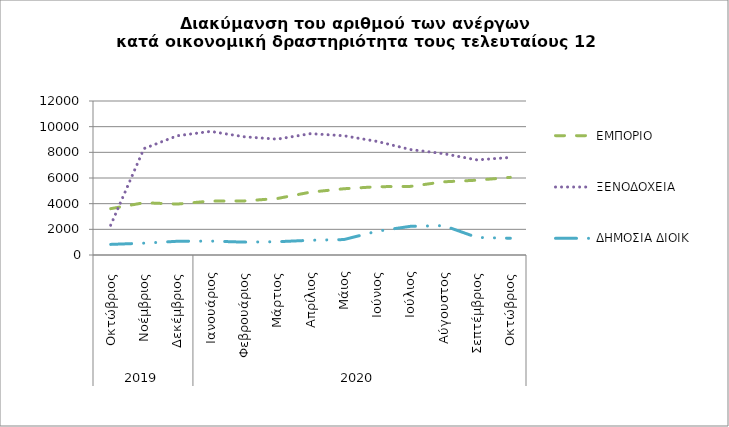
| Category | ΕΜΠΟΡΙΟ | ΞΕΝΟΔΟΧΕΙΑ | ΔΗΜΟΣΙΑ ΔΙΟΙΚ |
|---|---|---|---|
| 0 | 3610 | 2319 | 826 |
| 1 | 4072 | 8292 | 922 |
| 2 | 3969 | 9290 | 1069 |
| 3 | 4202 | 9632 | 1085 |
| 4 | 4212 | 9214 | 1003 |
| 5 | 4400 | 9028 | 1034 |
| 6 | 4898 | 9457 | 1149 |
| 7 | 5162 | 9293 | 1202 |
| 8 | 5321 | 8852 | 1854 |
| 9 | 5347 | 8216 | 2234 |
| 10 | 5703 | 7894 | 2289 |
| 11 | 5829 | 7409 | 1367 |
| 12 | 6051 | 7602 | 1307 |